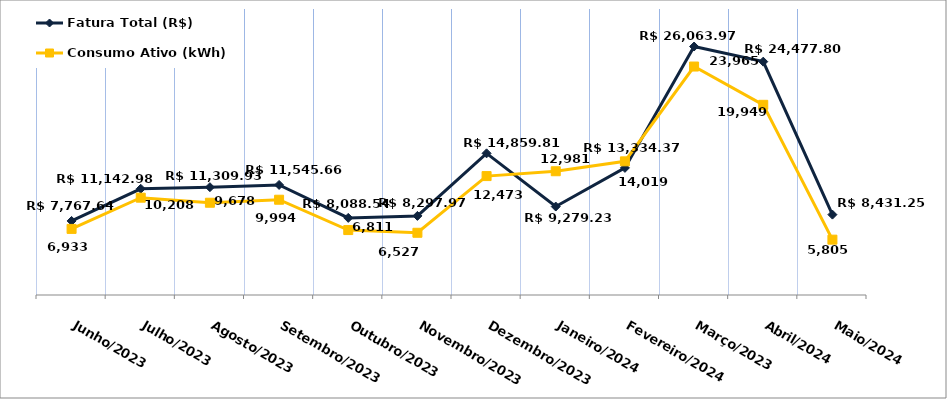
| Category | Fatura Total (R$) |
|---|---|
| Junho/2023 | 7767.64 |
| Julho/2023 | 11142.98 |
| Agosto/2023 | 11309.93 |
| Setembro/2023 | 11545.66 |
| Outubro/2023 | 8088.54 |
| Novembro/2023 | 8297.97 |
| Dezembro/2023 | 14859.81 |
| Janeiro/2024 | 9279.23 |
| Fevereiro/2024 | 13334.37 |
| Março/2023 | 26063.97 |
| Abril/2024 | 24477.8 |
| Maio/2024 | 8431.25 |